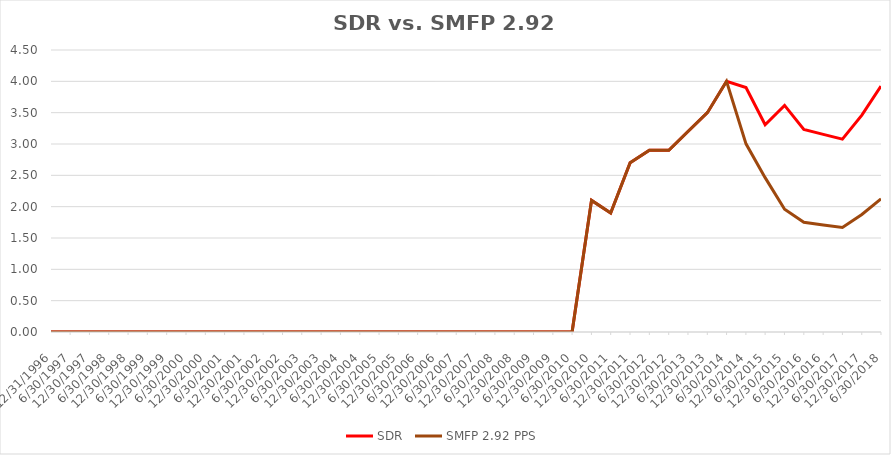
| Category | SDR | SMFP 2.92 PPS |
|---|---|---|
| 12/31/96 | 0 | 0 |
| 6/30/97 | 0 | 0 |
| 12/31/97 | 0 | 0 |
| 6/30/98 | 0 | 0 |
| 12/31/98 | 0 | 0 |
| 6/30/99 | 0 | 0 |
| 12/31/99 | 0 | 0 |
| 6/30/00 | 0 | 0 |
| 12/31/00 | 0 | 0 |
| 6/30/01 | 0 | 0 |
| 12/31/01 | 0 | 0 |
| 6/30/02 | 0 | 0 |
| 12/31/02 | 0 | 0 |
| 6/30/03 | 0 | 0 |
| 12/31/03 | 0 | 0 |
| 6/30/04 | 0 | 0 |
| 12/31/04 | 0 | 0 |
| 6/30/05 | 0 | 0 |
| 12/31/05 | 0 | 0 |
| 6/30/06 | 0 | 0 |
| 12/31/06 | 0 | 0 |
| 6/30/07 | 0 | 0 |
| 12/31/07 | 0 | 0 |
| 6/30/08 | 0 | 0 |
| 12/31/08 | 0 | 0 |
| 6/30/09 | 0 | 0 |
| 12/31/09 | 0 | 0 |
| 6/30/10 | 0 | 0 |
| 12/31/10 | 2.1 | 2.1 |
| 6/30/11 | 1.9 | 1.9 |
| 12/31/11 | 2.7 | 2.7 |
| 6/30/12 | 2.9 | 2.9 |
| 12/31/12 | 2.9 | 2.9 |
| 6/30/13 | 3.2 | 3.2 |
| 12/31/13 | 3.5 | 3.5 |
| 6/30/14 | 4 | 4 |
| 12/31/14 | 3.9 | 3.003 |
| 6/30/15 | 3.308 | 2.464 |
| 12/31/15 | 3.615 | 1.958 |
| 6/30/16 | 3.231 | 1.75 |
| 12/31/16 | 3.154 | 1.708 |
| 6/30/17 | 3.077 | 1.667 |
| 12/31/17 | 3.462 | 1.875 |
| 6/30/18 | 3.923 | 2.125 |